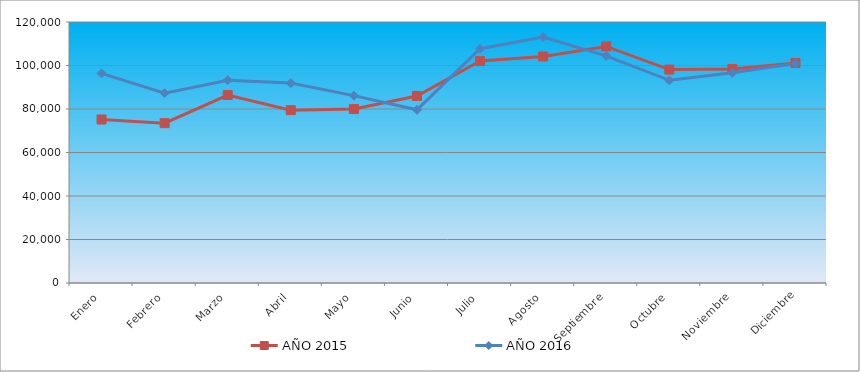
| Category | AÑO 2015 | AÑO 2016 |
|---|---|---|
| Enero | 75181.632 | 96406.451 |
| Febrero | 73477.969 | 87298.606 |
| Marzo | 86416.486 | 93253.097 |
| Abril | 79471.903 | 91905.61 |
| Mayo | 79969.649 | 86138.442 |
| Junio | 85998.769 | 79631.623 |
| Julio | 102044.774 | 107716.613 |
| Agosto | 104135.578 | 113128.937 |
| Septiembre | 108767.067 | 104401.083 |
| Octubre | 98121.719 | 93182.75 |
| Noviembre | 98403.786 | 96616.943 |
| Diciembre | 101166.405 | 100928.857 |